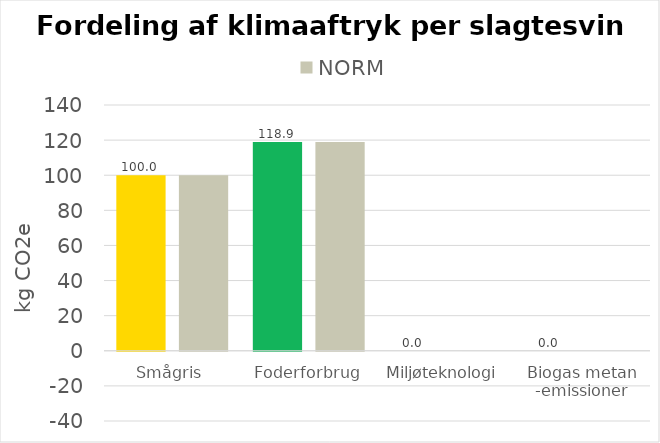
| Category | 100,00% | NORM |
|---|---|---|
| Smågris | 99.988 | 100 |
| Foderforbrug | 118.874 | 118.874 |
| Miljøteknologi | 0 | 0 |
| Biogas metan -emissioner | 0 | 0 |